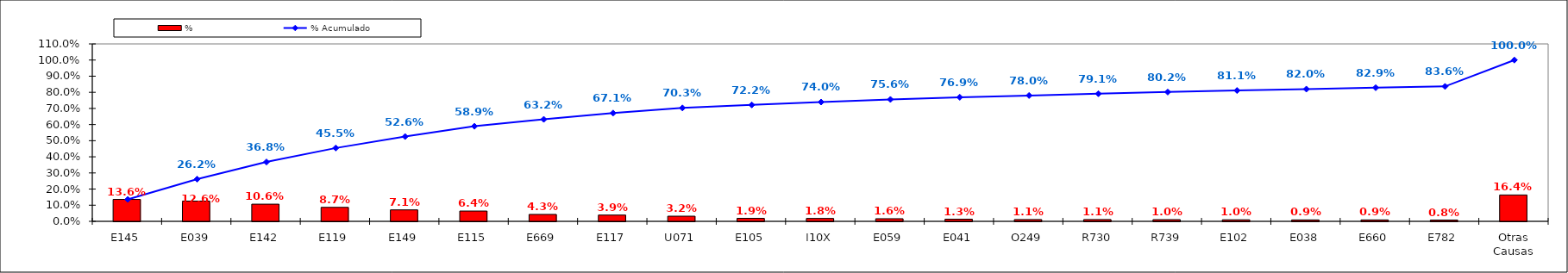
| Category | % |
|---|---|
| E145 | 0.136 |
| E039 | 0.126 |
| E142 | 0.106 |
| E119 | 0.087 |
| E149 | 0.071 |
| E115 | 0.064 |
| E669 | 0.043 |
| E117 | 0.039 |
| U071 | 0.032 |
| E105 | 0.019 |
| I10X | 0.018 |
| E059 | 0.016 |
| E041 | 0.013 |
| O249 | 0.011 |
| R730 | 0.011 |
| R739 | 0.01 |
| E102 | 0.01 |
| E038 | 0.009 |
| E660 | 0.009 |
| E782 | 0.008 |
| Otras Causas | 0.164 |